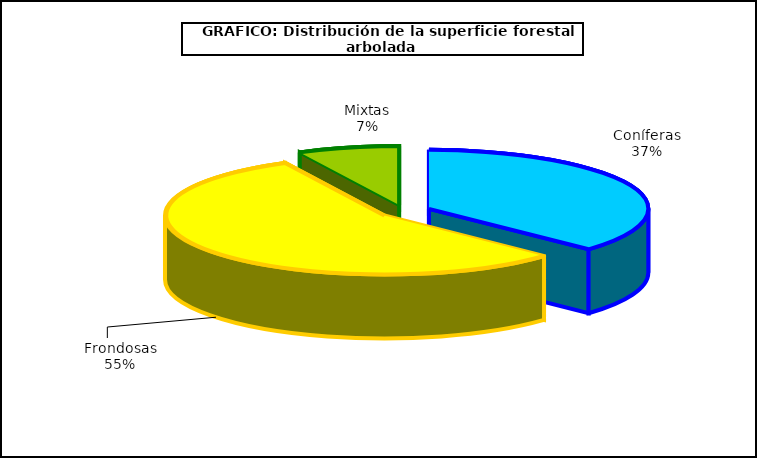
| Category | Series 0 |
|---|---|
| Coníferas | 6791744.951 |
| Frondosas | 10178714.758 |
| Mixtas | 1371615.436 |